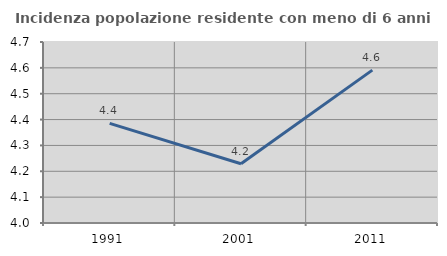
| Category | Incidenza popolazione residente con meno di 6 anni |
|---|---|
| 1991.0 | 4.386 |
| 2001.0 | 4.229 |
| 2011.0 | 4.591 |